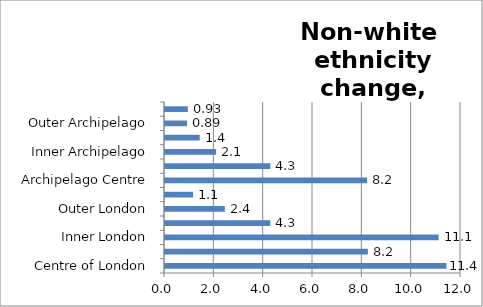
| Category | Series 0 |
|---|---|
| Centre of London | 11.409 |
| London Core | 8.223 |
| Inner London | 11.093 |
| London Suburbs | 4.268 |
| Outer London | 2.427 |
| London Edge | 1.14 |
| Archipelago Centre | 8.193 |
| Archipelago Core | 4.271 |
| Inner Archipelago | 2.071 |
| Archipelago Suburbs | 1.408 |
| Outer Archipelago | 0.894 |
| Archipelago Edge | 0.926 |